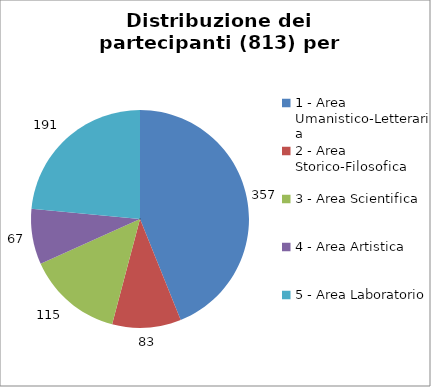
| Category | Nr. Partecipanti |
|---|---|
| 1 - Area Umanistico-Letteraria | 357 |
| 2 - Area Storico-Filosofica | 83 |
| 3 - Area Scientifica | 115 |
| 4 - Area Artistica | 67 |
| 5 - Area Laboratorio | 191 |